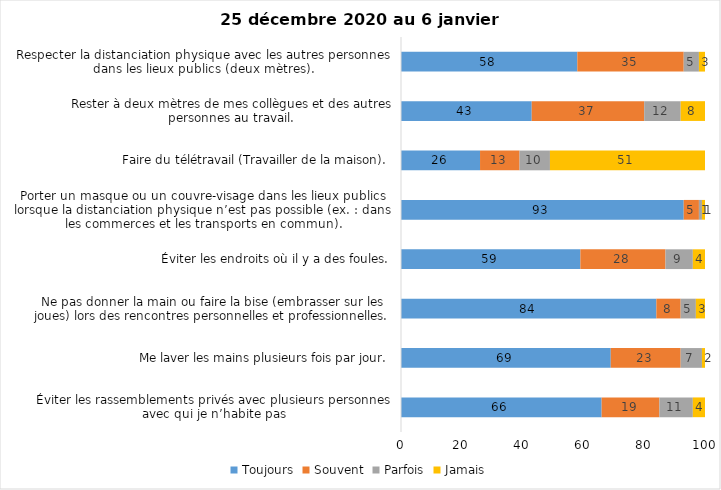
| Category | Toujours | Souvent | Parfois | Jamais |
|---|---|---|---|---|
| Éviter les rassemblements privés avec plusieurs personnes avec qui je n’habite pas | 66 | 19 | 11 | 4 |
| Me laver les mains plusieurs fois par jour. | 69 | 23 | 7 | 2 |
| Ne pas donner la main ou faire la bise (embrasser sur les joues) lors des rencontres personnelles et professionnelles. | 84 | 8 | 5 | 3 |
| Éviter les endroits où il y a des foules. | 59 | 28 | 9 | 4 |
| Porter un masque ou un couvre-visage dans les lieux publics lorsque la distanciation physique n’est pas possible (ex. : dans les commerces et les transports en commun). | 93 | 5 | 1 | 1 |
| Faire du télétravail (Travailler de la maison). | 26 | 13 | 10 | 51 |
| Rester à deux mètres de mes collègues et des autres personnes au travail. | 43 | 37 | 12 | 8 |
| Respecter la distanciation physique avec les autres personnes dans les lieux publics (deux mètres). | 58 | 35 | 5 | 3 |